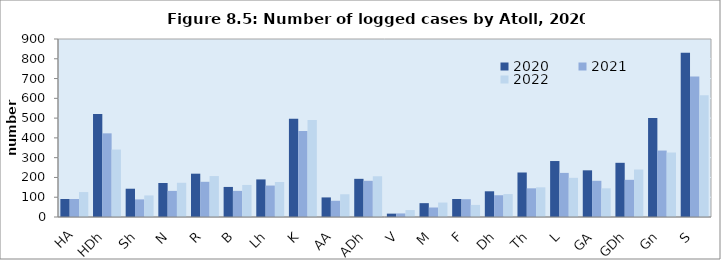
| Category | 2020  | 2021  | 2022  |
|---|---|---|---|
| HA | 91 | 91 | 126 |
| HDh | 521 | 423 | 341 |
| Sh | 143 | 89 | 109 |
| N | 172 | 132 | 173 |
| R | 219 | 178 | 207 |
| B | 152 | 132 | 162 |
| Lh | 190 | 159 | 177 |
| K | 497 | 435 | 490 |
| AA | 99 | 82 | 115 |
| ADh | 193 | 183 | 206 |
| V | 17 | 18 | 35 |
| M | 70 | 48 | 73 |
| F | 91 | 90 | 61 |
| Dh | 130 | 110 | 116 |
| Th | 225 | 145 | 150 |
| L | 283 | 223 | 198 |
| GA | 236 | 183 | 145 |
| GDh | 274 | 188 | 240 |
| Gn | 501 | 336 | 326 |
| S | 831 | 710 | 615 |